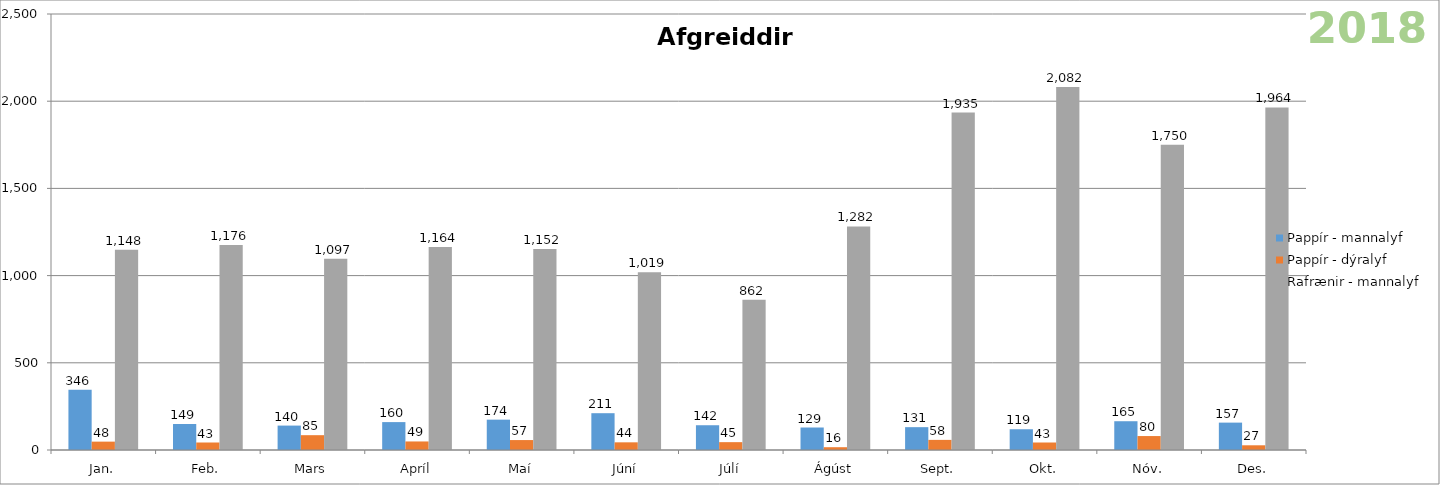
| Category | Pappír - mannalyf | Pappír - dýralyf | Rafrænir - mannalyf |
|---|---|---|---|
| Jan. | 346 | 48 | 1148 |
| Feb. | 149 | 43 | 1176 |
| Mars | 140 | 85 | 1097 |
| Apríl | 160 | 49 | 1164 |
| Maí | 174 | 57 | 1152 |
| Júní | 211 | 44 | 1019 |
| Júlí | 142 | 45 | 862 |
| Ágúst | 129 | 16 | 1282 |
| Sept. | 131 | 58 | 1935 |
| Okt. | 119 | 43 | 2082 |
| Nóv. | 165 | 80 | 1750 |
| Des. | 157 | 27 | 1964 |